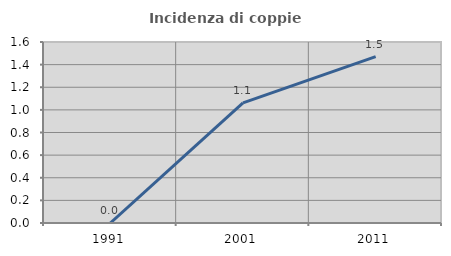
| Category | Incidenza di coppie miste |
|---|---|
| 1991.0 | 0 |
| 2001.0 | 1.062 |
| 2011.0 | 1.471 |